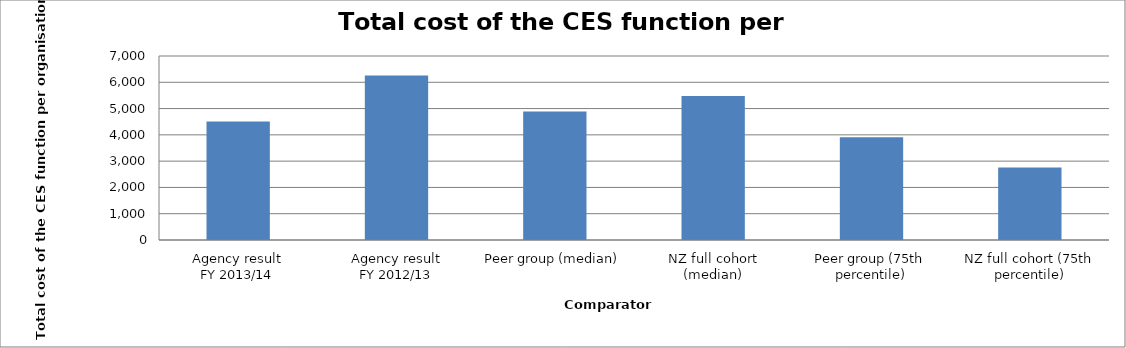
| Category | Result |
|---|---|
| Agency result
FY 2013/14 | 4507.27 |
| Agency result
FY 2012/13 | 6257.654 |
| Peer group (median) | 4890.062 |
| NZ full cohort (median) | 5473.881 |
| Peer group (75th percentile) | 3911.273 |
| NZ full cohort (75th percentile) | 2756.214 |